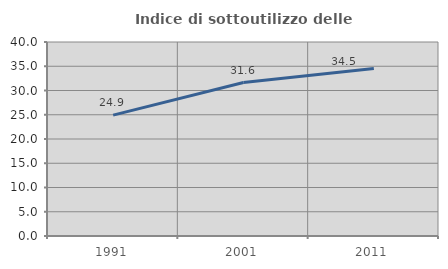
| Category | Indice di sottoutilizzo delle abitazioni  |
|---|---|
| 1991.0 | 24.925 |
| 2001.0 | 31.642 |
| 2011.0 | 34.516 |